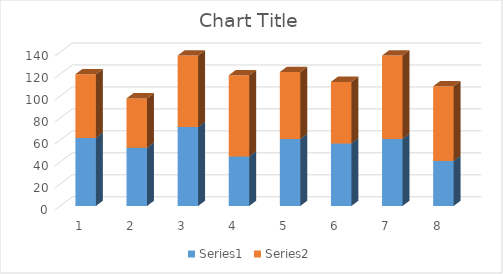
| Category | Series 0 | Series 1 |
|---|---|---|
| 0 | 62 | 58 |
| 1 | 53 | 45 |
| 2 | 72 | 65 |
| 3 | 45 | 74 |
| 4 | 61 | 61 |
| 5 | 57 | 56 |
| 6 | 61 | 76 |
| 7 | 41 | 68 |